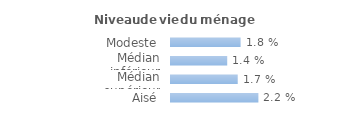
| Category | Series 0 |
|---|---|
| Modeste | 0.018 |
| Médian inférieur | 0.014 |
| Médian supérieur | 0.017 |
| Aisé | 0.022 |